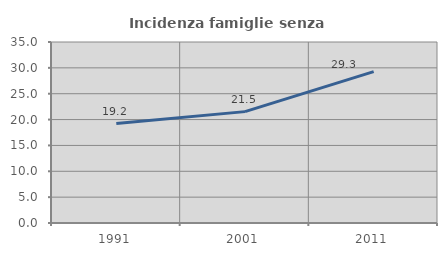
| Category | Incidenza famiglie senza nuclei |
|---|---|
| 1991.0 | 19.226 |
| 2001.0 | 21.537 |
| 2011.0 | 29.282 |